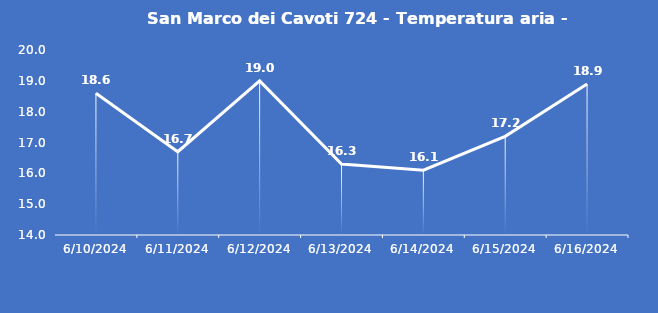
| Category | San Marco dei Cavoti 724 - Temperatura aria - Grezzo (°C) |
|---|---|
| 6/10/24 | 18.6 |
| 6/11/24 | 16.7 |
| 6/12/24 | 19 |
| 6/13/24 | 16.3 |
| 6/14/24 | 16.1 |
| 6/15/24 | 17.2 |
| 6/16/24 | 18.9 |